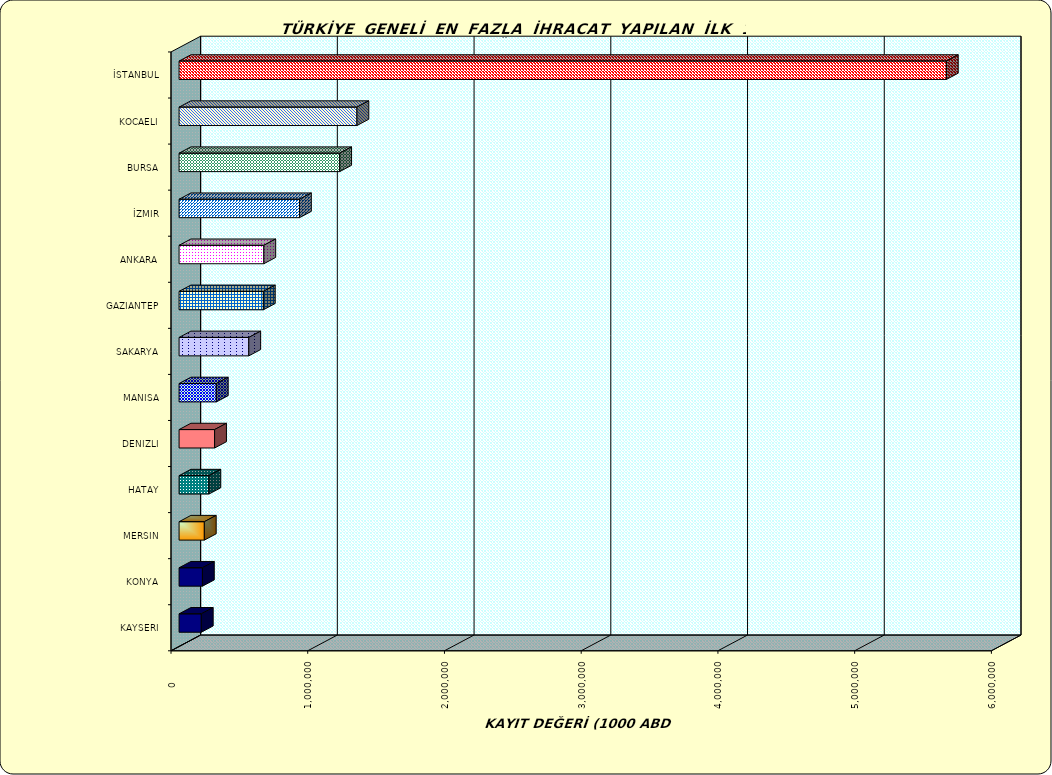
| Category | Series 0 |
|---|---|
| İSTANBUL | 5611591.158 |
| KOCAELI | 1300889.007 |
| BURSA | 1174755.681 |
| İZMIR | 880680.652 |
| ANKARA | 619829.846 |
| GAZIANTEP | 616491.306 |
| SAKARYA | 509968.14 |
| MANISA | 272446.405 |
| DENIZLI | 259847.15 |
| HATAY | 218176.788 |
| MERSIN | 184765.625 |
| KONYA | 170774.82 |
| KAYSERI | 162559.597 |